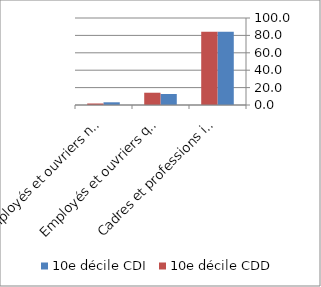
| Category | 10e décile CDI | 10e décile CDD |
|---|---|---|
| Cadres et professions intermédiaires | 84.242 | 84.146 |
| Employés et ouvriers qualifiés | 12.643 | 14.113 |
| Employés et ouvriers non qualifiés | 3.115 | 1.741 |